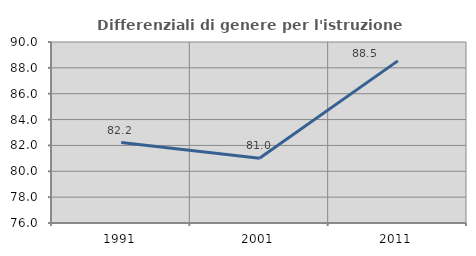
| Category | Differenziali di genere per l'istruzione superiore |
|---|---|
| 1991.0 | 82.225 |
| 2001.0 | 81.013 |
| 2011.0 | 88.541 |